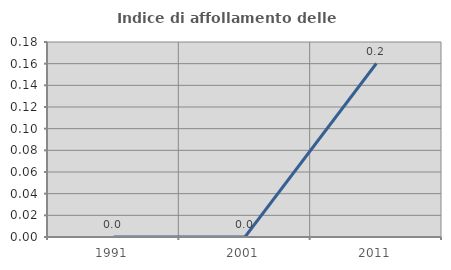
| Category | Indice di affollamento delle abitazioni  |
|---|---|
| 1991.0 | 0 |
| 2001.0 | 0 |
| 2011.0 | 0.16 |